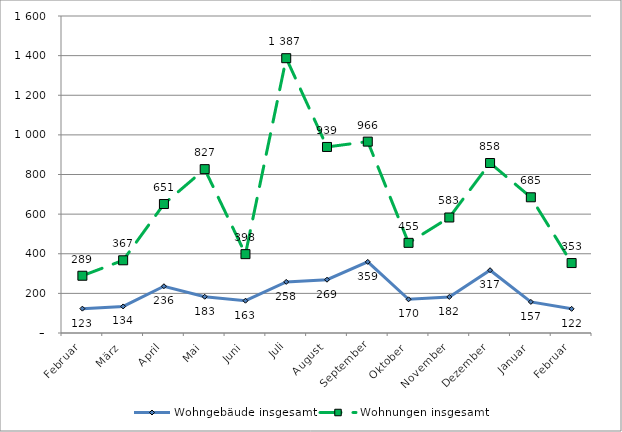
| Category | Wohngebäude insgesamt | Wohnungen insgesamt |
|---|---|---|
| Februar | 123 | 289 |
| März | 134 | 367 |
| April | 236 | 651 |
| Mai | 183 | 827 |
| Juni | 163 | 398 |
| Juli | 258 | 1387 |
| August | 269 | 939 |
| September | 359 | 966 |
| Oktober | 170 | 455 |
| November | 182 | 583 |
| Dezember | 317 | 858 |
| Januar | 157 | 685 |
| Februar | 122 | 353 |